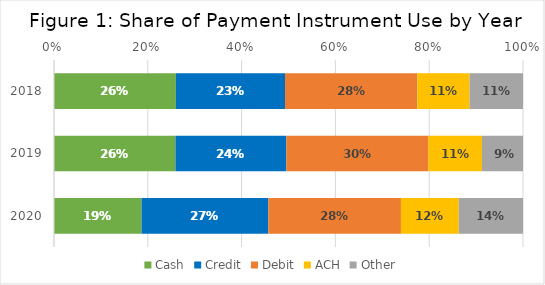
| Category | Cash | Credit | Debit | ACH | Other |
|---|---|---|---|---|---|
| 2018.0 | 0.26 | 0.233 | 0.282 | 0.111 | 0.114 |
| 2019.0 | 0.259 | 0.236 | 0.303 | 0.114 | 0.087 |
| 2020.0 | 0.187 | 0.27 | 0.283 | 0.123 | 0.137 |